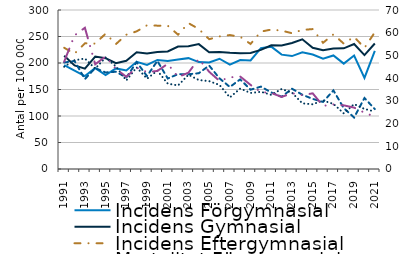
| Category | Incidens |
|---|---|
| 1991.0 | 228.683 |
| 1992.0 | 217.654 |
| 1993.0 | 237.166 |
| 1994.0 | 236.643 |
| 1995.0 | 255.345 |
| 1996.0 | 235.762 |
| 1997.0 | 253.398 |
| 1998.0 | 259.717 |
| 1999.0 | 271.143 |
| 2000.0 | 270.48 |
| 2001.0 | 270.416 |
| 2002.0 | 253.437 |
| 2003.0 | 275.199 |
| 2004.0 | 264.211 |
| 2005.0 | 244.87 |
| 2006.0 | 250.16 |
| 2007.0 | 252.73 |
| 2008.0 | 249.427 |
| 2009.0 | 235.941 |
| 2010.0 | 259.25 |
| 2011.0 | 263.106 |
| 2012.0 | 261.105 |
| 2013.0 | 256.17 |
| 2014.0 | 262.361 |
| 2015.0 | 263.998 |
| 2016.0 | 238.159 |
| 2017.0 | 253.951 |
| 2018.0 | 236.572 |
| 2019.0 | 249.344 |
| 2020.0 | 228.492 |
| 2021.0 | 257.845 |